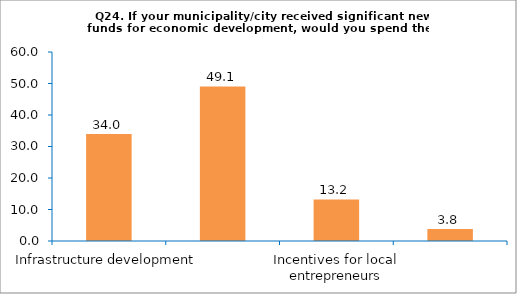
| Category | Series 0 |
|---|---|
| Infrastructure development | 33.962 |
| Business zones for attracting foreign investments | 49.057 |
| Incentives for local entrepreneurs | 13.208 |
| Education and professional development of the unemployed | 3.774 |